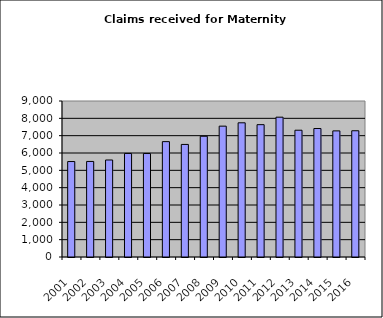
| Category | Series 1 |
|---|---|
| 2001.0 | 5507 |
| 2002.0 | 5513 |
| 2003.0 | 5597 |
| 2004.0 | 5974 |
| 2005.0 | 5970 |
| 2006.0 | 6656 |
| 2007.0 | 6494 |
| 2008.0 | 6966 |
| 2009.0 | 7549 |
| 2010.0 | 7742 |
| 2011.0 | 7635 |
| 2012.0 | 8067 |
| 2013.0 | 7314 |
| 2014.0 | 7412 |
| 2015.0 | 7276 |
| 2016.0 | 7283 |